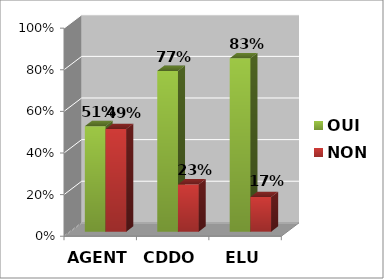
| Category | OUI | NON |
|---|---|---|
| AGENT | 0.507 | 0.493 |
| CDDO | 0.773 | 0.227 |
| ELU | 0.833 | 0.167 |